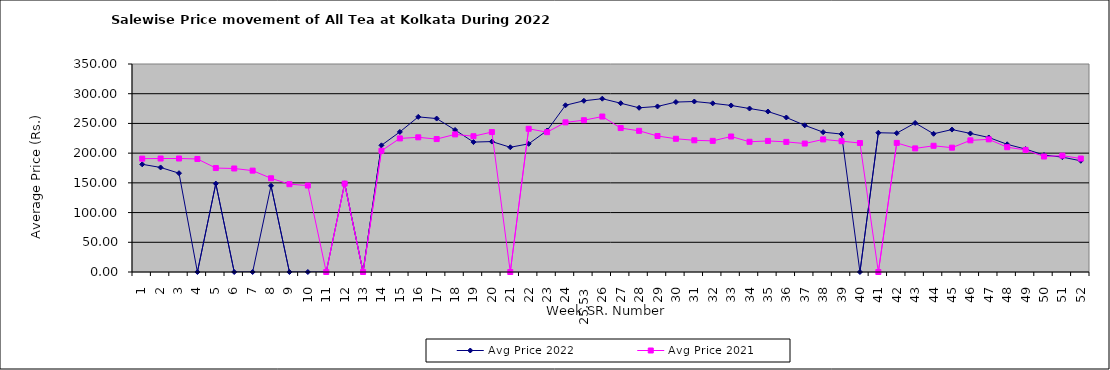
| Category | Avg Price 2022 | Avg Price 2021 |
|---|---|---|
| 1 | 181.211 | 190.742 |
| 2 | 175.908 | 190.947 |
| 3 | 166.252 | 190.964 |
| 4 | 0 | 190.212 |
| 5 | 148.763 | 174.907 |
| 6 | 0 | 174.162 |
| 7 | 0 | 170.575 |
| 8 | 145.087 | 157.713 |
| 9 | 0 | 147.729 |
| 10 | 0 | 145.495 |
| 11 | 0 | 0 |
| 12 | 149.085 | 148.743 |
| 13 | 0 | 0 |
| 14 | 213.175 | 203.979 |
| 15 | 235.683 | 224.793 |
| 16 | 261.004 | 226.627 |
| 17 | 258.205 | 223.693 |
| 18 | 238.969 | 231.555 |
| 19 | 218.595 | 228.456 |
| 20 | 219.477 | 235.473 |
| 21 | 209.875 | 0 |
| 22 | 215.657 | 240.962 |
| 23 | 237.972 | 235.302 |
| 24 | 280.56 | 251.801 |
| 25,53 | 288.1 | 255.381 |
| 26 | 291.609 | 261.6 |
| 27 | 284.001 | 242.187 |
| 28 | 276.286 | 237.551 |
| 29 | 278.574 | 228.853 |
| 30 | 285.93 | 224.17 |
| 31 | 286.875 | 221.636 |
| 32 | 283.838 | 220.657 |
| 33 | 280.244 | 227.988 |
| 34 | 275.088 | 219.094 |
| 35 | 270.042 | 220.589 |
| 36 | 259.988 | 218.919 |
| 37 | 246.812 | 216.135 |
| 38 | 235.301 | 223.106 |
| 39 | 232.096 | 220.099 |
| 40 | 0 | 217.035 |
| 41 | 234.322 | 0 |
| 42 | 233.653 | 217.224 |
| 43 | 250.779 | 207.974 |
| 44 | 232.589 | 212.386 |
| 45 | 239.652 | 209.183 |
| 46 | 233.166 | 221.526 |
| 47 | 226.373 | 223.214 |
| 48 | 214.846 | 209.994 |
| 49 | 206.802 | 205.409 |
| 50 | 196.84 | 194.322 |
| 51 | 193.251 | 195.829 |
| 52 | 187.139 | 190.91 |